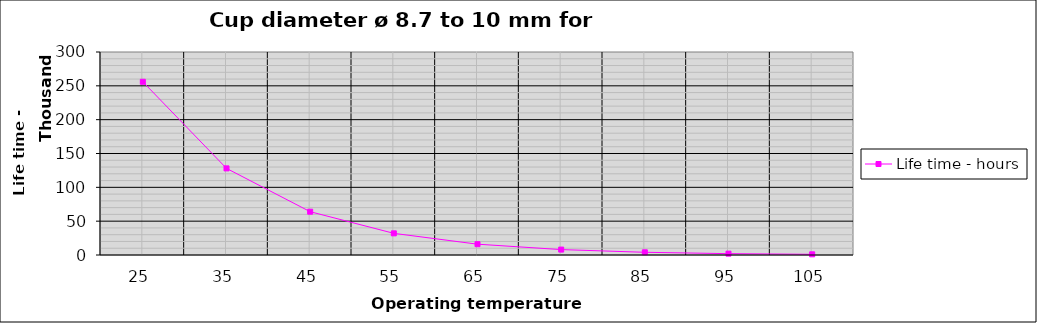
| Category | Life time - hours |
|---|---|
| 25.0 | 256000 |
| 35.0 | 128000 |
| 45.0 | 64000 |
| 55.0 | 32000 |
| 65.0 | 16000 |
| 75.0 | 8000 |
| 85.0 | 4000 |
| 95.0 | 2000 |
| 105.0 | 1000 |